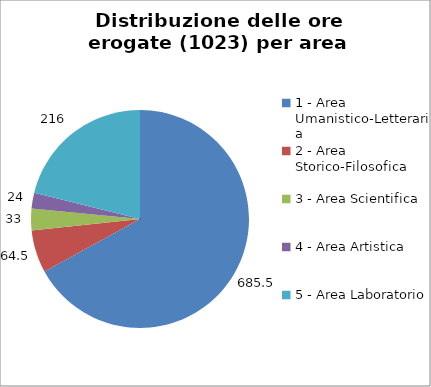
| Category | Nr. Ore Erogate |
|---|---|
| 1 - Area Umanistico-Letteraria | 685.5 |
| 2 - Area Storico-Filosofica | 64.5 |
| 3 - Area Scientifica | 33 |
| 4 - Area Artistica | 24 |
| 5 - Area Laboratorio | 216 |